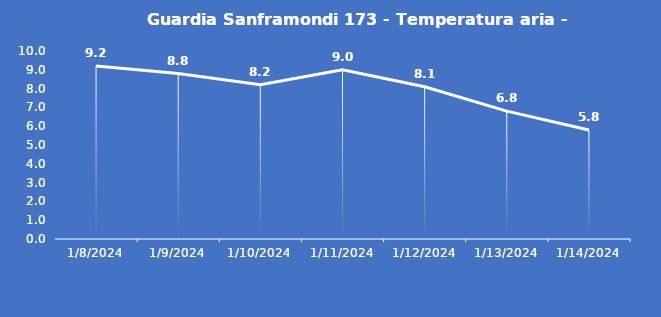
| Category | Guardia Sanframondi 173 - Temperatura aria - Grezzo (°C) |
|---|---|
| 1/8/24 | 9.2 |
| 1/9/24 | 8.8 |
| 1/10/24 | 8.2 |
| 1/11/24 | 9 |
| 1/12/24 | 8.1 |
| 1/13/24 | 6.8 |
| 1/14/24 | 5.8 |